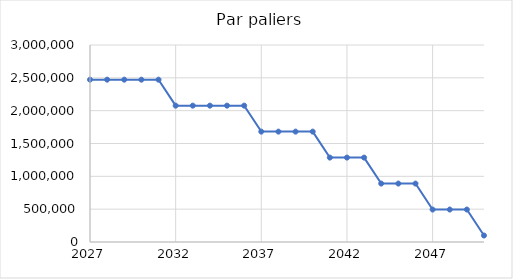
| Category | Emissions (t eqCO2) |
|---|---|
| 2027.0 | 2471976 |
| 2028.0 | 2471976 |
| 2029.0 | 2471976 |
| 2030.0 | 2471976 |
| 2031.0 | 2471976 |
| 2032.0 | 2076446.667 |
| 2033.0 | 2076446.667 |
| 2034.0 | 2076446.667 |
| 2035.0 | 2076446.667 |
| 2036.0 | 2076446.667 |
| 2037.0 | 1680917.333 |
| 2038.0 | 1680917.333 |
| 2039.0 | 1680917.333 |
| 2040.0 | 1680917.333 |
| 2041.0 | 1285388 |
| 2042.0 | 1285388 |
| 2043.0 | 1285388 |
| 2044.0 | 889858.667 |
| 2045.0 | 889858.667 |
| 2046.0 | 889858.667 |
| 2047.0 | 494329.333 |
| 2048.0 | 494329.333 |
| 2049.0 | 494329.333 |
| 2050.0 | 98800 |